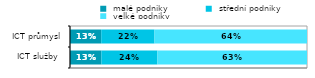
| Category |  malé podniky |  střední podniky |  velké podniky |
|---|---|---|---|
| ICT služby  | 0.132 | 0.236 | 0.631 |
| ICT průmysl | 0.132 | 0.225 | 0.643 |